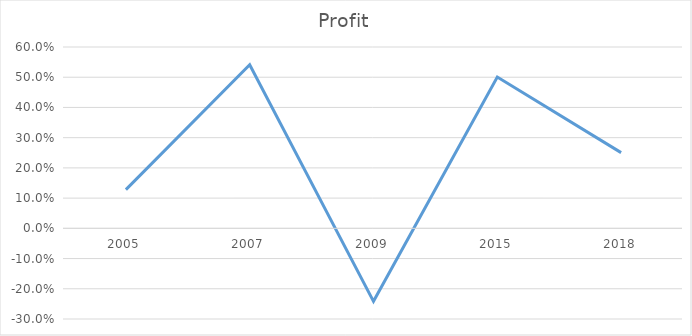
| Category | Series 0 |
|---|---|
| 2005 | 0.128 |
| 2007 | 0.541 |
| 2009 | -0.242 |
| 2015 | 0.5 |
| 2018 | 0.251 |